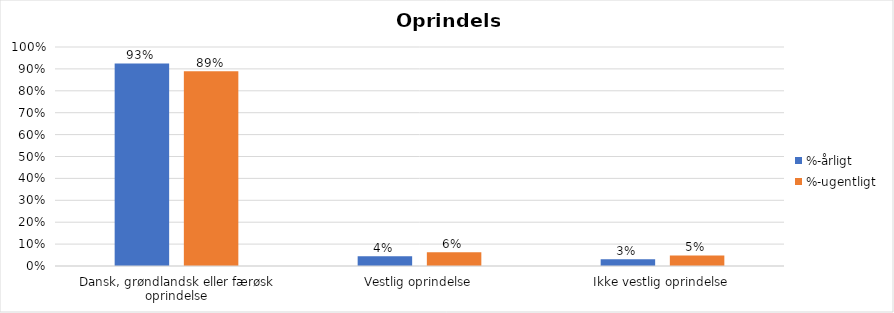
| Category | %-årligt | %-ugentligt |
|---|---|---|
| Dansk, grøndlandsk eller færøsk oprindelse | 0.925 | 0.889 |
| Vestlig oprindelse | 0.044 | 0.063 |
| Ikke vestlig oprindelse | 0.03 | 0.048 |